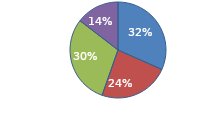
| Category | T.Ingresos | %Ingresos |
|---|---|---|
| direct | 500 | 0.214 |
| organic | 375 | 0.286 |
| other | 475 | 0.286 |
| referal | 230 | 0.214 |